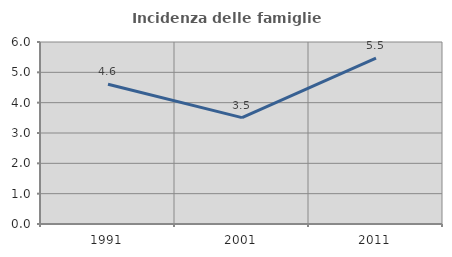
| Category | Incidenza delle famiglie numerose |
|---|---|
| 1991.0 | 4.609 |
| 2001.0 | 3.507 |
| 2011.0 | 5.47 |